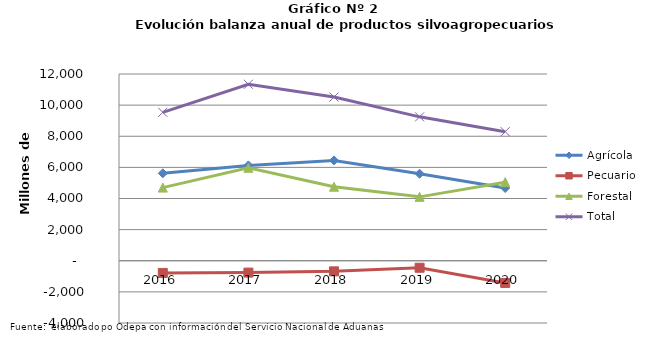
| Category | Agrícola | Pecuario | Forestal | Total |
|---|---|---|---|---|
| 2016.0 | 5619304 | -782654 | 4700192 | 9536842 |
| 2017.0 | 6126434 | -761998 | 5976134 | 11340570 |
| 2018.0 | 6446329 | -681646 | 4755333 | 10520016 |
| 2019.0 | 5590965 | -450130 | 4105622 | 9246457 |
| 2020.0 | 4672099 | -1424944 | 5048454 | 8295609 |